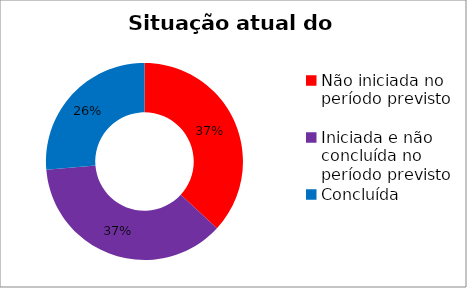
| Category | Series 0 |
|---|---|
| Não iniciada no período previsto | 0.368 |
| Iniciada e não concluída no período previsto | 0.368 |
| Concluída | 0.263 |